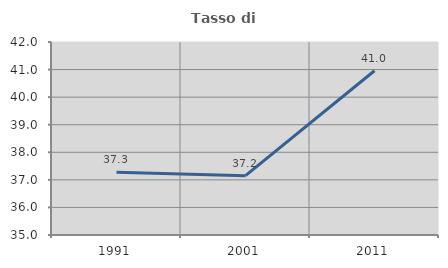
| Category | Tasso di occupazione   |
|---|---|
| 1991.0 | 37.279 |
| 2001.0 | 37.152 |
| 2011.0 | 40.956 |